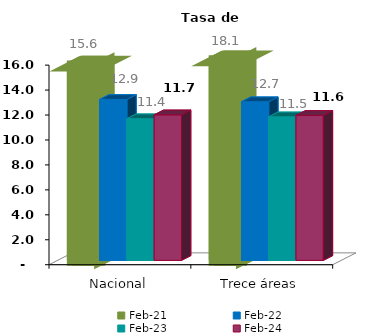
| Category | feb-21 | feb-22 | feb-23 | feb-24 |
|---|---|---|---|---|
|  Nacional  | 15.585 | 12.905 | 11.353 | 11.666 |
|  Trece áreas  | 18.069 | 12.718 | 11.506 | 11.622 |